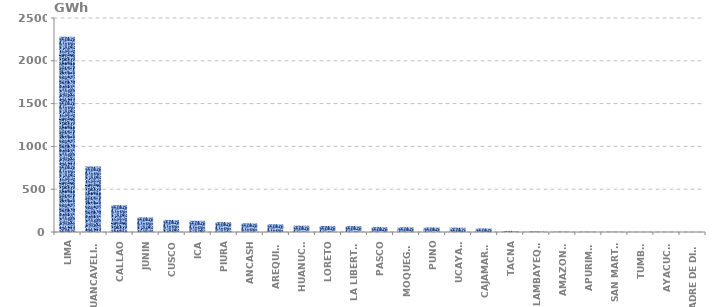
| Category | Series 0 |
|---|---|
| LIMA | 2279.659 |
| HUANCAVELICA | 764.863 |
| CALLAO | 313.317 |
| JUNIN | 170.481 |
| CUSCO | 140.532 |
| ICA | 131.317 |
| PIURA | 115.19 |
| ANCASH | 101.367 |
| AREQUIPA | 89.848 |
| HUANUCO | 73.722 |
| LORETO | 70.957 |
| LA LIBERTAD | 69.114 |
| PASCO | 57.134 |
| MOQUEGUA | 55.291 |
| PUNO | 52.987 |
| UCAYALI | 50.684 |
| CAJAMARCA | 41.468 |
| TACNA | 11.749 |
| LAMBAYEQUE | 6.911 |
| AMAZONAS | 3.916 |
| APURIMAC | 2.765 |
| SAN MARTÍN | 2.304 |
| TUMBES | 1.106 |
| AYACUCHO | 0.806 |
| MADRE DE DIOS | 0.115 |